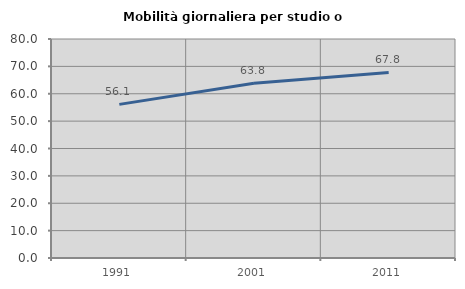
| Category | Mobilità giornaliera per studio o lavoro |
|---|---|
| 1991.0 | 56.125 |
| 2001.0 | 63.824 |
| 2011.0 | 67.763 |